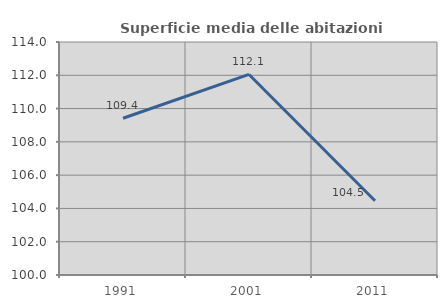
| Category | Superficie media delle abitazioni occupate |
|---|---|
| 1991.0 | 109.418 |
| 2001.0 | 112.05 |
| 2011.0 | 104.465 |